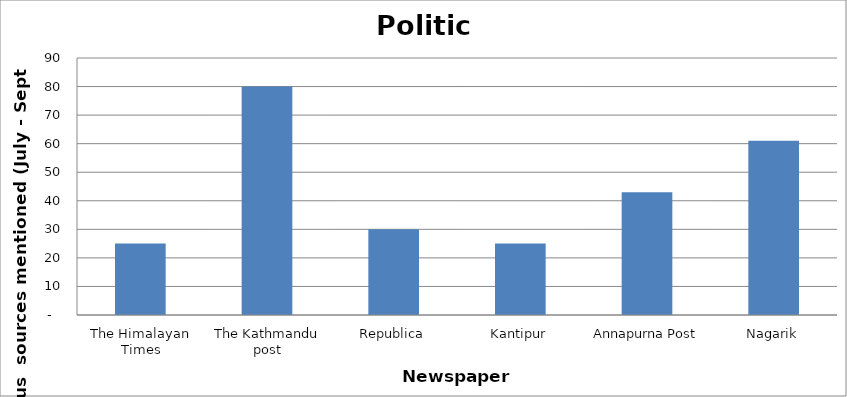
| Category | Politics |
|---|---|
| The Himalayan Times | 25 |
| The Kathmandu post | 80 |
| Republica | 30 |
| Kantipur | 25 |
| Annapurna Post | 43 |
| Nagarik | 61 |